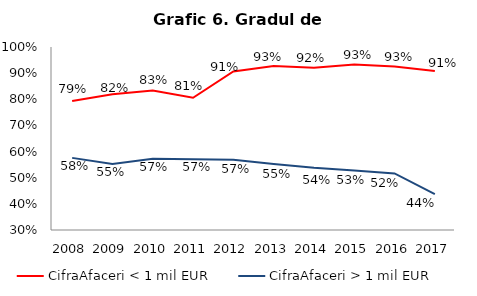
| Category | CifraAfaceri < 1 mil EUR | CifraAfaceri > 1 mil EUR |
|---|---|---|
| 2008.0 | 0.793 | 0.576 |
| 2009.0 | 0.82 | 0.553 |
| 2010.0 | 0.834 | 0.573 |
| 2011.0 | 0.806 | 0.571 |
| 2012.0 | 0.906 | 0.569 |
| 2013.0 | 0.927 | 0.553 |
| 2014.0 | 0.921 | 0.538 |
| 2015.0 | 0.933 | 0.528 |
| 2016.0 | 0.926 | 0.516 |
| 2017.0 | 0.908 | 0.437 |